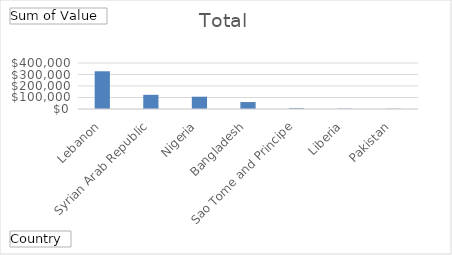
| Category | Total |
|---|---|
| Lebanon | 328100 |
| Syrian Arab Republic | 123406.14 |
| Nigeria | 106722 |
| Bangladesh | 60357.2 |
| Sao Tome and Principe | 6900 |
| Liberia | 3225 |
| Pakistan | 2240 |